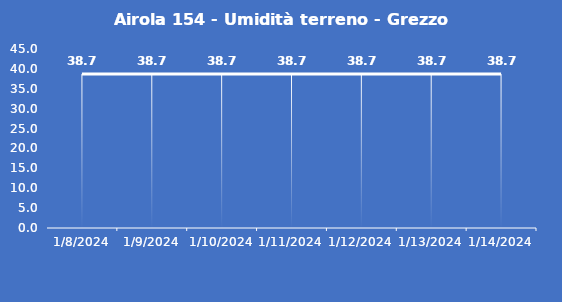
| Category | Airola 154 - Umidità terreno - Grezzo (%VWC) |
|---|---|
| 1/8/24 | 38.7 |
| 1/9/24 | 38.7 |
| 1/10/24 | 38.7 |
| 1/11/24 | 38.7 |
| 1/12/24 | 38.7 |
| 1/13/24 | 38.7 |
| 1/14/24 | 38.7 |